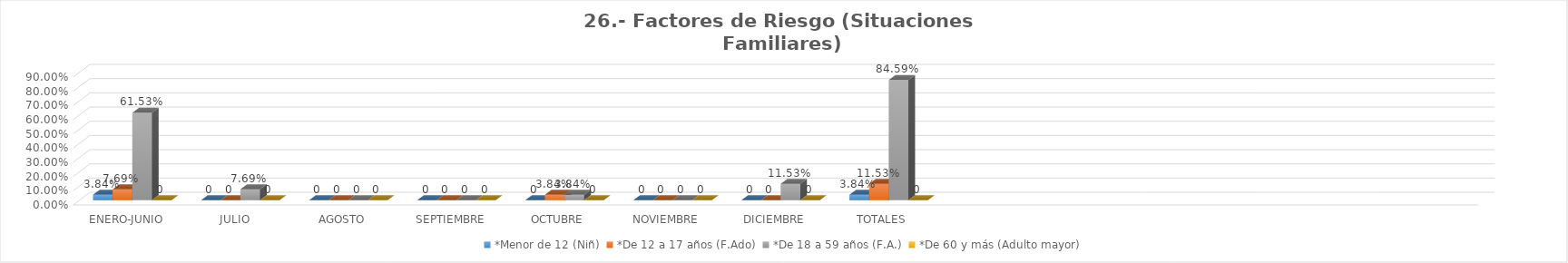
| Category | *Menor de 12 (Niñ) | *De 12 a 17 años (F.Ado) | *De 18 a 59 años (F.A.) | *De 60 y más (Adulto mayor) |
|---|---|---|---|---|
| ENERO-JUNIO | 0.038 | 0.077 | 0.615 | 0 |
| JULIO | 0 | 0 | 0.077 | 0 |
| AGOSTO | 0 | 0 | 0 | 0 |
| SEPTIEMBRE | 0 | 0 | 0 | 0 |
| OCTUBRE | 0 | 0.038 | 0.038 | 0 |
| NOVIEMBRE | 0 | 0 | 0 | 0 |
| DICIEMBRE | 0 | 0 | 0.115 | 0 |
| TOTALES | 0.038 | 0.115 | 0.846 | 0 |